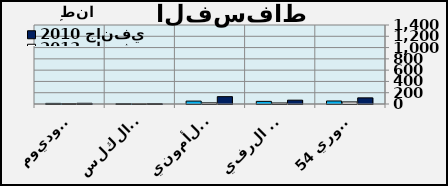
| Category | 2010 جانفي | 2013 جانفي  | 2014 جانفي  |
|---|---|---|---|
| الحامض الفسفوري 54% | 108.861 | 36.778 | 53.551 |
| ثلاثي الفسفاط الرفيع | 68.049 | 17.995 | 46.742 |
| ثاني فسفاط الأمونيا | 130.2 | 20.17 | 51.58 |
| ثاني فسفاط الكلس | 6.04 | 2.4 | 5.81 |
| فسفاط الصوديوم  | 12.52 | 7.345 | 11.025 |